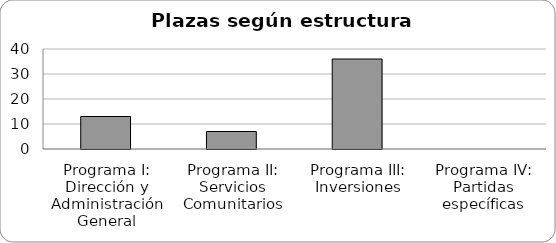
| Category | Series 0 |
|---|---|
| Programa I: Dirección y Administración General | 13 |
| Programa II: Servicios Comunitarios | 7 |
| Programa III: Inversiones | 36 |
| Programa IV: Partidas específicas | 0 |